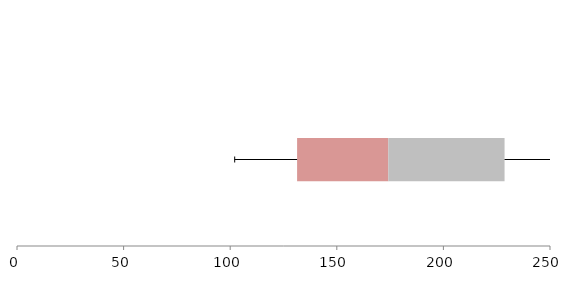
| Category | Series 1 | Series 2 | Series 3 |
|---|---|---|---|
| 0 | 131.376 | 42.773 | 54.541 |